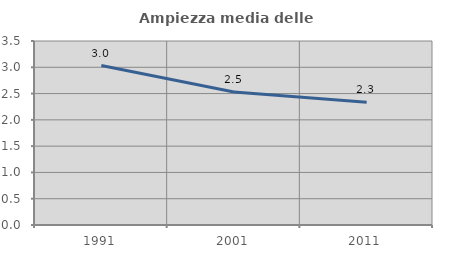
| Category | Ampiezza media delle famiglie |
|---|---|
| 1991.0 | 3.033 |
| 2001.0 | 2.531 |
| 2011.0 | 2.336 |